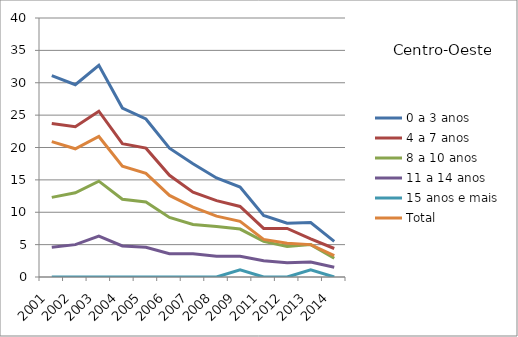
| Category | 0 a 3 anos | 4 a 7 anos | 8 a 10 anos | 11 a 14 anos | 15 anos e mais | Total |
|---|---|---|---|---|---|---|
| 2001.0 | 31.1 | 23.7 | 12.3 | 4.6 | 0 | 20.9 |
| 2002.0 | 29.7 | 23.2 | 13 | 5 | 0 | 19.8 |
| 2003.0 | 32.7 | 25.6 | 14.8 | 6.3 | 0 | 21.7 |
| 2004.0 | 26.1 | 20.6 | 12 | 4.8 | 0 | 17.1 |
| 2005.0 | 24.4 | 19.9 | 11.6 | 4.6 | 0 | 16 |
| 2006.0 | 19.9 | 15.7 | 9.2 | 3.6 | 0 | 12.6 |
| 2007.0 | 17.5 | 13.1 | 8.1 | 3.6 | 0 | 10.8 |
| 2008.0 | 15.3 | 11.8 | 7.8 | 3.2 | 0 | 9.4 |
| 2009.0 | 13.9 | 10.9 | 7.4 | 3.2 | 1.1 | 8.6 |
| 2011.0 | 9.5 | 7.5 | 5.5 | 2.5 | 0 | 5.8 |
| 2012.0 | 8.3 | 7.5 | 4.7 | 2.2 | 0 | 5.2 |
| 2013.0 | 8.4 | 5.9 | 5 | 2.3 | 1.1 | 5 |
| 2014.0 | 5.5 | 4.4 | 2.9 | 1.5 | 0 | 3.3 |